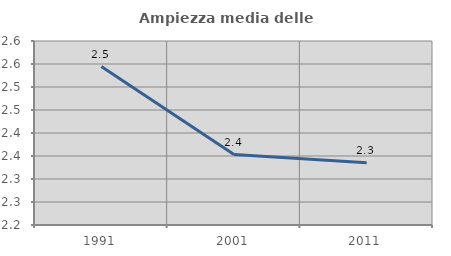
| Category | Ampiezza media delle famiglie |
|---|---|
| 1991.0 | 2.544 |
| 2001.0 | 2.353 |
| 2011.0 | 2.335 |